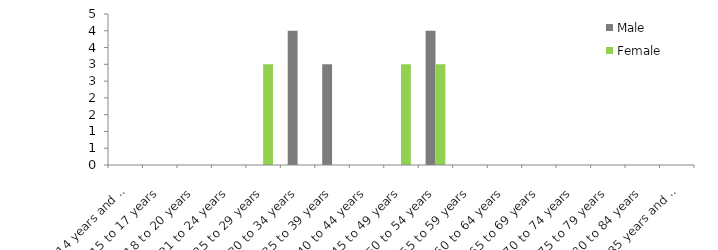
| Category | Male | Female |
|---|---|---|
| 14 years and under | 0 | 0 |
| 15 to 17 years | 0 | 0 |
| 18 to 20 years | 0 | 0 |
| 21 to 24 years | 0 | 0 |
| 25 to 29 years | 0 | 3 |
| 30 to 34 years | 4 | 0 |
| 35 to 39 years | 3 | 0 |
| 40 to 44 years | 0 | 0 |
| 45 to 49 years | 0 | 3 |
| 50 to 54 years | 4 | 3 |
| 55 to 59 years | 0 | 0 |
| 60 to 64 years | 0 | 0 |
| 65 to 69 years | 0 | 0 |
| 70 to 74 years | 0 | 0 |
| 75 to 79 years | 0 | 0 |
| 80 to 84 years | 0 | 0 |
| 85 years and over | 0 | 0 |